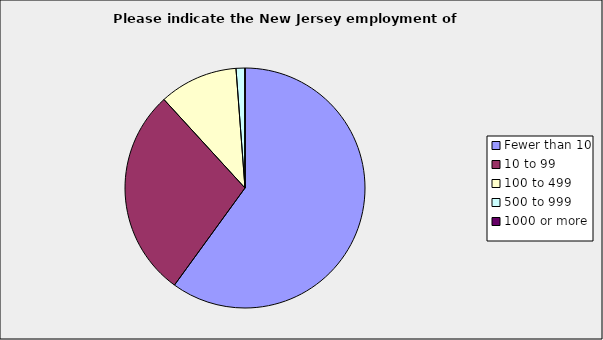
| Category | Series 0 |
|---|---|
| Fewer than 10 | 0.6 |
| 10 to 99 | 0.282 |
| 100 to 499 | 0.106 |
| 500 to 999 | 0.012 |
| 1000 or more | 0 |